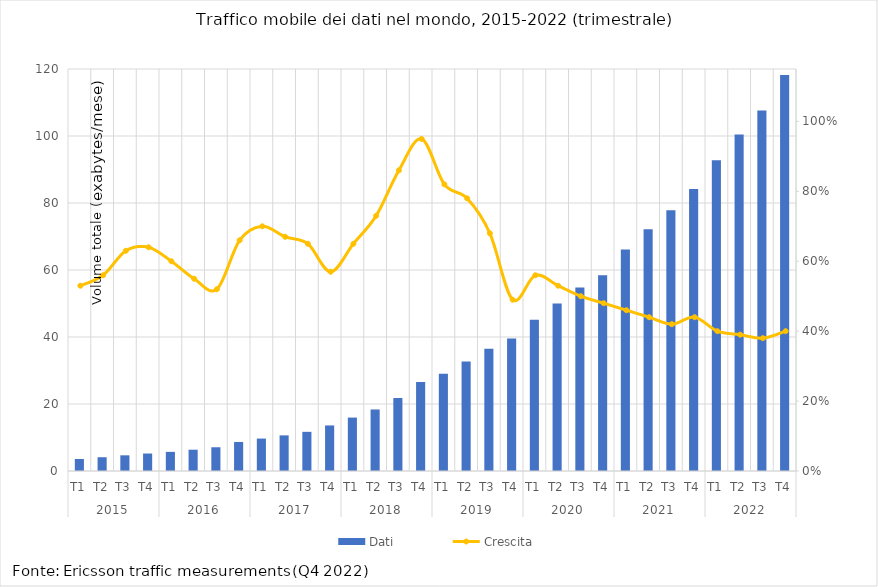
| Category | Dati |
|---|---|
| 0 | 3.577 |
| 1 | 4.107 |
| 2 | 4.678 |
| 3 | 5.217 |
| 4 | 5.712 |
| 5 | 6.358 |
| 6 | 7.089 |
| 7 | 8.667 |
| 8 | 9.682 |
| 9 | 10.634 |
| 10 | 11.691 |
| 11 | 13.599 |
| 12 | 15.944 |
| 13 | 18.37 |
| 14 | 21.783 |
| 15 | 26.538 |
| 16 | 29.021 |
| 17 | 32.661 |
| 18 | 36.493 |
| 19 | 39.559 |
| 20 | 45.164 |
| 21 | 50.025 |
| 22 | 54.794 |
| 23 | 58.442 |
| 24 | 66.138 |
| 25 | 72.2 |
| 26 | 77.81 |
| 27 | 84.162 |
| 28 | 92.746 |
| 29 | 100.42 |
| 30 | 107.58 |
| 31 | 118.214 |